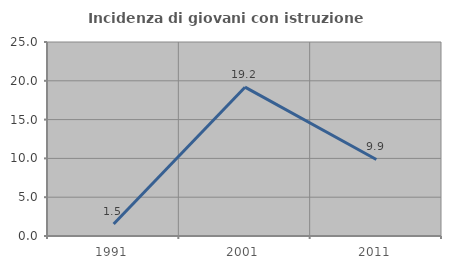
| Category | Incidenza di giovani con istruzione universitaria |
|---|---|
| 1991.0 | 1.538 |
| 2001.0 | 19.178 |
| 2011.0 | 9.859 |